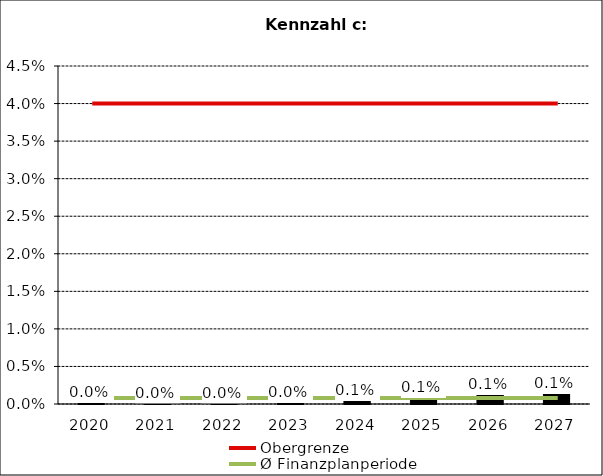
| Category | Zinsbelastungsanteil |
|---|---|
| 2020.0 | 0 |
| 2021.0 | 0 |
| 2022.0 | 0 |
| 2023.0 | 0 |
| 2024.0 | 0.001 |
| 2025.0 | 0.001 |
| 2026.0 | 0.001 |
| 2027.0 | 0.001 |